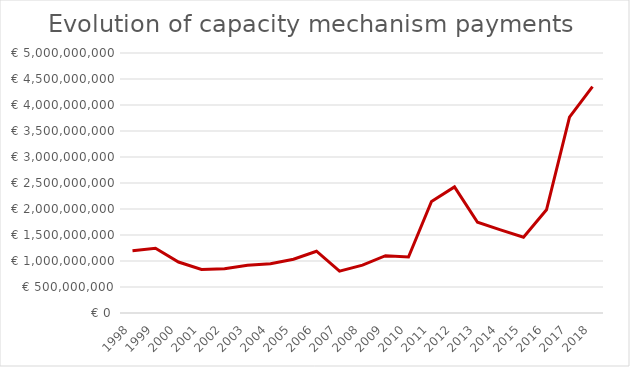
| Category | Payment amount |
|---|---|
| 1998.0 | 1198817000 |
| 1999.0 | 1245089000 |
| 2000.0 | 980093000 |
| 2001.0 | 836925000 |
| 2002.0 | 852917000 |
| 2003.0 | 919166000 |
| 2004.0 | 947800000 |
| 2005.0 | 1033600000 |
| 2006.0 | 1187848635 |
| 2007.0 | 804678833.54 |
| 2008.0 | 920246134 |
| 2009.0 | 1101336859 |
| 2010.0 | 1076988872 |
| 2011.0 | 2145799192 |
| 2012.0 | 2424877268 |
| 2013.0 | 1744790391 |
| 2014.0 | 1599830162.38 |
| 2015.0 | 1458115352.98 |
| 2016.0 | 1984095290.412 |
| 2017.0 | 3767526376.19 |
| 2018.0 | 4351721417.948 |